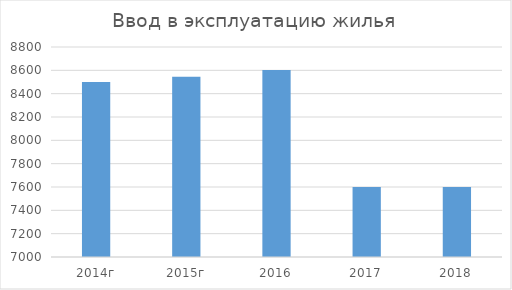
| Category | Ввод в эксплуатацию жилья |
|---|---|
| 2014г | 8500 |
| 2015г | 8544 |
| 2016 | 8602 |
| 2017 | 7600 |
| 2018 | 7600 |